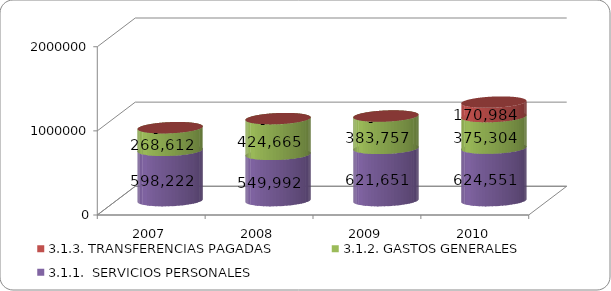
| Category | 3.1.1.  SERVICIOS PERSONALES | 3.1.2. GASTOS GENERALES | 3.1.3. TRANSFERENCIAS PAGADAS |
|---|---|---|---|
| 2007 | 598222.16 | 268611.694 | 0 |
| 2008 | 549991.842 | 424665.176 | 0 |
| 2009 | 621650.835 | 383757.322 | 0 |
| 2010 | 624551 | 375304 | 170984 |